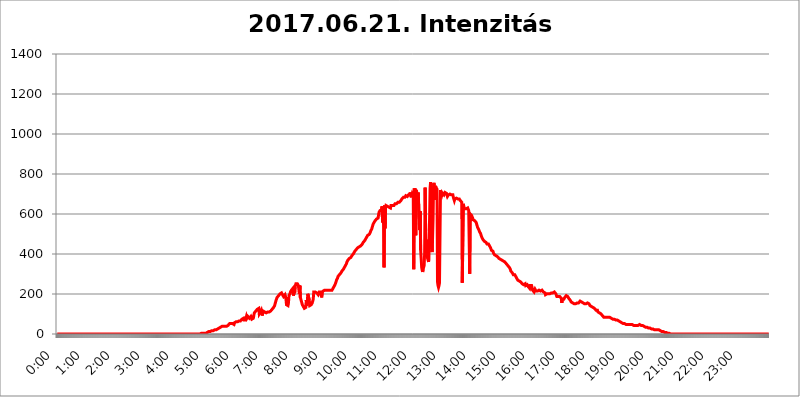
| Category | 2017.06.21. Intenzitás [W/m^2] |
|---|---|
| 0.0 | 0 |
| 0.0006944444444444445 | 0 |
| 0.001388888888888889 | 0 |
| 0.0020833333333333333 | 0 |
| 0.002777777777777778 | 0 |
| 0.003472222222222222 | 0 |
| 0.004166666666666667 | 0 |
| 0.004861111111111111 | 0 |
| 0.005555555555555556 | 0 |
| 0.0062499999999999995 | 0 |
| 0.006944444444444444 | 0 |
| 0.007638888888888889 | 0 |
| 0.008333333333333333 | 0 |
| 0.009027777777777779 | 0 |
| 0.009722222222222222 | 0 |
| 0.010416666666666666 | 0 |
| 0.011111111111111112 | 0 |
| 0.011805555555555555 | 0 |
| 0.012499999999999999 | 0 |
| 0.013194444444444444 | 0 |
| 0.013888888888888888 | 0 |
| 0.014583333333333332 | 0 |
| 0.015277777777777777 | 0 |
| 0.015972222222222224 | 0 |
| 0.016666666666666666 | 0 |
| 0.017361111111111112 | 0 |
| 0.018055555555555557 | 0 |
| 0.01875 | 0 |
| 0.019444444444444445 | 0 |
| 0.02013888888888889 | 0 |
| 0.020833333333333332 | 0 |
| 0.02152777777777778 | 0 |
| 0.022222222222222223 | 0 |
| 0.02291666666666667 | 0 |
| 0.02361111111111111 | 0 |
| 0.024305555555555556 | 0 |
| 0.024999999999999998 | 0 |
| 0.025694444444444447 | 0 |
| 0.02638888888888889 | 0 |
| 0.027083333333333334 | 0 |
| 0.027777777777777776 | 0 |
| 0.02847222222222222 | 0 |
| 0.029166666666666664 | 0 |
| 0.029861111111111113 | 0 |
| 0.030555555555555555 | 0 |
| 0.03125 | 0 |
| 0.03194444444444445 | 0 |
| 0.03263888888888889 | 0 |
| 0.03333333333333333 | 0 |
| 0.034027777777777775 | 0 |
| 0.034722222222222224 | 0 |
| 0.035416666666666666 | 0 |
| 0.036111111111111115 | 0 |
| 0.03680555555555556 | 0 |
| 0.0375 | 0 |
| 0.03819444444444444 | 0 |
| 0.03888888888888889 | 0 |
| 0.03958333333333333 | 0 |
| 0.04027777777777778 | 0 |
| 0.04097222222222222 | 0 |
| 0.041666666666666664 | 0 |
| 0.042361111111111106 | 0 |
| 0.04305555555555556 | 0 |
| 0.043750000000000004 | 0 |
| 0.044444444444444446 | 0 |
| 0.04513888888888889 | 0 |
| 0.04583333333333334 | 0 |
| 0.04652777777777778 | 0 |
| 0.04722222222222222 | 0 |
| 0.04791666666666666 | 0 |
| 0.04861111111111111 | 0 |
| 0.049305555555555554 | 0 |
| 0.049999999999999996 | 0 |
| 0.05069444444444445 | 0 |
| 0.051388888888888894 | 0 |
| 0.052083333333333336 | 0 |
| 0.05277777777777778 | 0 |
| 0.05347222222222222 | 0 |
| 0.05416666666666667 | 0 |
| 0.05486111111111111 | 0 |
| 0.05555555555555555 | 0 |
| 0.05625 | 0 |
| 0.05694444444444444 | 0 |
| 0.057638888888888885 | 0 |
| 0.05833333333333333 | 0 |
| 0.05902777777777778 | 0 |
| 0.059722222222222225 | 0 |
| 0.06041666666666667 | 0 |
| 0.061111111111111116 | 0 |
| 0.06180555555555556 | 0 |
| 0.0625 | 0 |
| 0.06319444444444444 | 0 |
| 0.06388888888888888 | 0 |
| 0.06458333333333334 | 0 |
| 0.06527777777777778 | 0 |
| 0.06597222222222222 | 0 |
| 0.06666666666666667 | 0 |
| 0.06736111111111111 | 0 |
| 0.06805555555555555 | 0 |
| 0.06874999999999999 | 0 |
| 0.06944444444444443 | 0 |
| 0.07013888888888889 | 0 |
| 0.07083333333333333 | 0 |
| 0.07152777777777779 | 0 |
| 0.07222222222222223 | 0 |
| 0.07291666666666667 | 0 |
| 0.07361111111111111 | 0 |
| 0.07430555555555556 | 0 |
| 0.075 | 0 |
| 0.07569444444444444 | 0 |
| 0.0763888888888889 | 0 |
| 0.07708333333333334 | 0 |
| 0.07777777777777778 | 0 |
| 0.07847222222222222 | 0 |
| 0.07916666666666666 | 0 |
| 0.0798611111111111 | 0 |
| 0.08055555555555556 | 0 |
| 0.08125 | 0 |
| 0.08194444444444444 | 0 |
| 0.08263888888888889 | 0 |
| 0.08333333333333333 | 0 |
| 0.08402777777777777 | 0 |
| 0.08472222222222221 | 0 |
| 0.08541666666666665 | 0 |
| 0.08611111111111112 | 0 |
| 0.08680555555555557 | 0 |
| 0.08750000000000001 | 0 |
| 0.08819444444444445 | 0 |
| 0.08888888888888889 | 0 |
| 0.08958333333333333 | 0 |
| 0.09027777777777778 | 0 |
| 0.09097222222222222 | 0 |
| 0.09166666666666667 | 0 |
| 0.09236111111111112 | 0 |
| 0.09305555555555556 | 0 |
| 0.09375 | 0 |
| 0.09444444444444444 | 0 |
| 0.09513888888888888 | 0 |
| 0.09583333333333333 | 0 |
| 0.09652777777777777 | 0 |
| 0.09722222222222222 | 0 |
| 0.09791666666666667 | 0 |
| 0.09861111111111111 | 0 |
| 0.09930555555555555 | 0 |
| 0.09999999999999999 | 0 |
| 0.10069444444444443 | 0 |
| 0.1013888888888889 | 0 |
| 0.10208333333333335 | 0 |
| 0.10277777777777779 | 0 |
| 0.10347222222222223 | 0 |
| 0.10416666666666667 | 0 |
| 0.10486111111111111 | 0 |
| 0.10555555555555556 | 0 |
| 0.10625 | 0 |
| 0.10694444444444444 | 0 |
| 0.1076388888888889 | 0 |
| 0.10833333333333334 | 0 |
| 0.10902777777777778 | 0 |
| 0.10972222222222222 | 0 |
| 0.1111111111111111 | 0 |
| 0.11180555555555556 | 0 |
| 0.11180555555555556 | 0 |
| 0.1125 | 0 |
| 0.11319444444444444 | 0 |
| 0.11388888888888889 | 0 |
| 0.11458333333333333 | 0 |
| 0.11527777777777777 | 0 |
| 0.11597222222222221 | 0 |
| 0.11666666666666665 | 0 |
| 0.1173611111111111 | 0 |
| 0.11805555555555557 | 0 |
| 0.11944444444444445 | 0 |
| 0.12013888888888889 | 0 |
| 0.12083333333333333 | 0 |
| 0.12152777777777778 | 0 |
| 0.12222222222222223 | 0 |
| 0.12291666666666667 | 0 |
| 0.12291666666666667 | 0 |
| 0.12361111111111112 | 0 |
| 0.12430555555555556 | 0 |
| 0.125 | 0 |
| 0.12569444444444444 | 0 |
| 0.12638888888888888 | 0 |
| 0.12708333333333333 | 0 |
| 0.16875 | 0 |
| 0.12847222222222224 | 0 |
| 0.12916666666666668 | 0 |
| 0.12986111111111112 | 0 |
| 0.13055555555555556 | 0 |
| 0.13125 | 0 |
| 0.13194444444444445 | 0 |
| 0.1326388888888889 | 0 |
| 0.13333333333333333 | 0 |
| 0.13402777777777777 | 0 |
| 0.13402777777777777 | 0 |
| 0.13472222222222222 | 0 |
| 0.13541666666666666 | 0 |
| 0.1361111111111111 | 0 |
| 0.13749999999999998 | 0 |
| 0.13819444444444443 | 0 |
| 0.1388888888888889 | 0 |
| 0.13958333333333334 | 0 |
| 0.14027777777777778 | 0 |
| 0.14097222222222222 | 0 |
| 0.14166666666666666 | 0 |
| 0.1423611111111111 | 0 |
| 0.14305555555555557 | 0 |
| 0.14375000000000002 | 0 |
| 0.14444444444444446 | 0 |
| 0.1451388888888889 | 0 |
| 0.1451388888888889 | 0 |
| 0.14652777777777778 | 0 |
| 0.14722222222222223 | 0 |
| 0.14791666666666667 | 0 |
| 0.1486111111111111 | 0 |
| 0.14930555555555555 | 0 |
| 0.15 | 0 |
| 0.15069444444444444 | 0 |
| 0.15138888888888888 | 0 |
| 0.15208333333333332 | 0 |
| 0.15277777777777776 | 0 |
| 0.15347222222222223 | 0 |
| 0.15416666666666667 | 0 |
| 0.15486111111111112 | 0 |
| 0.15555555555555556 | 0 |
| 0.15625 | 0 |
| 0.15694444444444444 | 0 |
| 0.15763888888888888 | 0 |
| 0.15833333333333333 | 0 |
| 0.15902777777777777 | 0 |
| 0.15972222222222224 | 0 |
| 0.16041666666666668 | 0 |
| 0.16111111111111112 | 0 |
| 0.16180555555555556 | 0 |
| 0.1625 | 0 |
| 0.16319444444444445 | 0 |
| 0.1638888888888889 | 0 |
| 0.16458333333333333 | 0 |
| 0.16527777777777777 | 0 |
| 0.16597222222222222 | 0 |
| 0.16666666666666666 | 0 |
| 0.1673611111111111 | 0 |
| 0.16805555555555554 | 0 |
| 0.16874999999999998 | 0 |
| 0.16944444444444443 | 0 |
| 0.17013888888888887 | 0 |
| 0.1708333333333333 | 0 |
| 0.17152777777777775 | 0 |
| 0.17222222222222225 | 0 |
| 0.1729166666666667 | 0 |
| 0.17361111111111113 | 0 |
| 0.17430555555555557 | 0 |
| 0.17500000000000002 | 0 |
| 0.17569444444444446 | 0 |
| 0.1763888888888889 | 0 |
| 0.17708333333333334 | 0 |
| 0.17777777777777778 | 0 |
| 0.17847222222222223 | 0 |
| 0.17916666666666667 | 0 |
| 0.1798611111111111 | 0 |
| 0.18055555555555555 | 0 |
| 0.18125 | 0 |
| 0.18194444444444444 | 0 |
| 0.1826388888888889 | 0 |
| 0.18333333333333335 | 0 |
| 0.1840277777777778 | 0 |
| 0.18472222222222223 | 0 |
| 0.18541666666666667 | 0 |
| 0.18611111111111112 | 0 |
| 0.18680555555555556 | 0 |
| 0.1875 | 0 |
| 0.18819444444444444 | 0 |
| 0.18888888888888888 | 0 |
| 0.18958333333333333 | 0 |
| 0.19027777777777777 | 0 |
| 0.1909722222222222 | 0 |
| 0.19166666666666665 | 0 |
| 0.19236111111111112 | 0 |
| 0.19305555555555554 | 0 |
| 0.19375 | 0 |
| 0.19444444444444445 | 0 |
| 0.1951388888888889 | 0 |
| 0.19583333333333333 | 0 |
| 0.19652777777777777 | 0 |
| 0.19722222222222222 | 0 |
| 0.19791666666666666 | 0 |
| 0.1986111111111111 | 0 |
| 0.19930555555555554 | 0 |
| 0.19999999999999998 | 0 |
| 0.20069444444444443 | 0 |
| 0.20138888888888887 | 3.525 |
| 0.2020833333333333 | 3.525 |
| 0.2027777777777778 | 3.525 |
| 0.2034722222222222 | 3.525 |
| 0.2041666666666667 | 3.525 |
| 0.20486111111111113 | 3.525 |
| 0.20555555555555557 | 3.525 |
| 0.20625000000000002 | 3.525 |
| 0.20694444444444446 | 3.525 |
| 0.2076388888888889 | 3.525 |
| 0.20833333333333334 | 3.525 |
| 0.20902777777777778 | 7.887 |
| 0.20972222222222223 | 7.887 |
| 0.21041666666666667 | 7.887 |
| 0.2111111111111111 | 7.887 |
| 0.21180555555555555 | 7.887 |
| 0.2125 | 12.257 |
| 0.21319444444444444 | 12.257 |
| 0.2138888888888889 | 12.257 |
| 0.21458333333333335 | 12.257 |
| 0.2152777777777778 | 12.257 |
| 0.21597222222222223 | 12.257 |
| 0.21666666666666667 | 16.636 |
| 0.21736111111111112 | 16.636 |
| 0.21805555555555556 | 16.636 |
| 0.21875 | 16.636 |
| 0.21944444444444444 | 21.024 |
| 0.22013888888888888 | 21.024 |
| 0.22083333333333333 | 21.024 |
| 0.22152777777777777 | 21.024 |
| 0.2222222222222222 | 21.024 |
| 0.22291666666666665 | 21.024 |
| 0.2236111111111111 | 21.024 |
| 0.22430555555555556 | 25.419 |
| 0.225 | 25.419 |
| 0.22569444444444445 | 25.419 |
| 0.2263888888888889 | 29.823 |
| 0.22708333333333333 | 29.823 |
| 0.22777777777777777 | 29.823 |
| 0.22847222222222222 | 34.234 |
| 0.22916666666666666 | 34.234 |
| 0.2298611111111111 | 34.234 |
| 0.23055555555555554 | 34.234 |
| 0.23124999999999998 | 38.653 |
| 0.23194444444444443 | 38.653 |
| 0.23263888888888887 | 38.653 |
| 0.2333333333333333 | 38.653 |
| 0.2340277777777778 | 38.653 |
| 0.2347222222222222 | 38.653 |
| 0.2354166666666667 | 38.653 |
| 0.23611111111111113 | 38.653 |
| 0.23680555555555557 | 38.653 |
| 0.23750000000000002 | 38.653 |
| 0.23819444444444446 | 38.653 |
| 0.2388888888888889 | 38.653 |
| 0.23958333333333334 | 43.079 |
| 0.24027777777777778 | 47.511 |
| 0.24097222222222223 | 47.511 |
| 0.24166666666666667 | 51.951 |
| 0.2423611111111111 | 51.951 |
| 0.24305555555555555 | 51.951 |
| 0.24375 | 51.951 |
| 0.24444444444444446 | 51.951 |
| 0.24513888888888888 | 51.951 |
| 0.24583333333333335 | 51.951 |
| 0.2465277777777778 | 51.951 |
| 0.24722222222222223 | 51.951 |
| 0.24791666666666667 | 47.511 |
| 0.24861111111111112 | 56.398 |
| 0.24930555555555556 | 56.398 |
| 0.25 | 56.398 |
| 0.25069444444444444 | 60.85 |
| 0.2513888888888889 | 60.85 |
| 0.2520833333333333 | 60.85 |
| 0.25277777777777777 | 60.85 |
| 0.2534722222222222 | 65.31 |
| 0.25416666666666665 | 65.31 |
| 0.2548611111111111 | 65.31 |
| 0.2555555555555556 | 65.31 |
| 0.25625000000000003 | 65.31 |
| 0.2569444444444445 | 65.31 |
| 0.2576388888888889 | 69.775 |
| 0.25833333333333336 | 69.775 |
| 0.2590277777777778 | 74.246 |
| 0.25972222222222224 | 74.246 |
| 0.2604166666666667 | 78.722 |
| 0.2611111111111111 | 78.722 |
| 0.26180555555555557 | 69.775 |
| 0.2625 | 65.31 |
| 0.26319444444444445 | 65.31 |
| 0.2638888888888889 | 69.775 |
| 0.26458333333333334 | 74.246 |
| 0.2652777777777778 | 87.692 |
| 0.2659722222222222 | 78.722 |
| 0.26666666666666666 | 74.246 |
| 0.2673611111111111 | 87.692 |
| 0.26805555555555555 | 83.205 |
| 0.26875 | 83.205 |
| 0.26944444444444443 | 78.722 |
| 0.2701388888888889 | 74.246 |
| 0.2708333333333333 | 74.246 |
| 0.27152777777777776 | 87.692 |
| 0.2722222222222222 | 83.205 |
| 0.27291666666666664 | 74.246 |
| 0.2736111111111111 | 74.246 |
| 0.2743055555555555 | 74.246 |
| 0.27499999999999997 | 78.722 |
| 0.27569444444444446 | 83.205 |
| 0.27638888888888885 | 105.69 |
| 0.27708333333333335 | 110.201 |
| 0.2777777777777778 | 110.201 |
| 0.27847222222222223 | 114.716 |
| 0.2791666666666667 | 114.716 |
| 0.2798611111111111 | 119.235 |
| 0.28055555555555556 | 123.758 |
| 0.28125 | 123.758 |
| 0.28194444444444444 | 128.284 |
| 0.2826388888888889 | 128.284 |
| 0.2833333333333333 | 101.184 |
| 0.28402777777777777 | 101.184 |
| 0.2847222222222222 | 110.201 |
| 0.28541666666666665 | 110.201 |
| 0.28611111111111115 | 119.235 |
| 0.28680555555555554 | 105.69 |
| 0.28750000000000003 | 92.184 |
| 0.2881944444444445 | 87.692 |
| 0.2888888888888889 | 114.716 |
| 0.28958333333333336 | 110.201 |
| 0.2902777777777778 | 110.201 |
| 0.29097222222222224 | 110.201 |
| 0.2916666666666667 | 105.69 |
| 0.2923611111111111 | 105.69 |
| 0.29305555555555557 | 105.69 |
| 0.29375 | 105.69 |
| 0.29444444444444445 | 105.69 |
| 0.2951388888888889 | 110.201 |
| 0.29583333333333334 | 110.201 |
| 0.2965277777777778 | 110.201 |
| 0.2972222222222222 | 110.201 |
| 0.29791666666666666 | 114.716 |
| 0.2986111111111111 | 114.716 |
| 0.29930555555555555 | 114.716 |
| 0.3 | 119.235 |
| 0.30069444444444443 | 119.235 |
| 0.3013888888888889 | 123.758 |
| 0.3020833333333333 | 128.284 |
| 0.30277777777777776 | 128.284 |
| 0.3034722222222222 | 132.814 |
| 0.30416666666666664 | 137.347 |
| 0.3048611111111111 | 141.884 |
| 0.3055555555555555 | 150.964 |
| 0.30624999999999997 | 155.509 |
| 0.3069444444444444 | 169.156 |
| 0.3076388888888889 | 173.709 |
| 0.30833333333333335 | 182.82 |
| 0.3090277777777778 | 182.82 |
| 0.30972222222222223 | 187.378 |
| 0.3104166666666667 | 191.937 |
| 0.3111111111111111 | 191.937 |
| 0.31180555555555556 | 196.497 |
| 0.3125 | 201.058 |
| 0.31319444444444444 | 201.058 |
| 0.3138888888888889 | 205.62 |
| 0.3145833333333333 | 205.62 |
| 0.31527777777777777 | 201.058 |
| 0.3159722222222222 | 196.497 |
| 0.31666666666666665 | 191.937 |
| 0.31736111111111115 | 187.378 |
| 0.31805555555555554 | 182.82 |
| 0.31875000000000003 | 182.82 |
| 0.3194444444444445 | 196.497 |
| 0.3201388888888889 | 187.378 |
| 0.32083333333333336 | 173.709 |
| 0.3215277777777778 | 146.423 |
| 0.32222222222222224 | 141.884 |
| 0.3229166666666667 | 141.884 |
| 0.3236111111111111 | 141.884 |
| 0.32430555555555557 | 155.509 |
| 0.325 | 191.937 |
| 0.32569444444444445 | 196.497 |
| 0.3263888888888889 | 201.058 |
| 0.32708333333333334 | 210.182 |
| 0.3277777777777778 | 214.746 |
| 0.3284722222222222 | 219.309 |
| 0.32916666666666666 | 223.873 |
| 0.3298611111111111 | 223.873 |
| 0.33055555555555555 | 228.436 |
| 0.33125 | 191.937 |
| 0.33194444444444443 | 201.058 |
| 0.3326388888888889 | 205.62 |
| 0.3333333333333333 | 210.182 |
| 0.3340277777777778 | 242.127 |
| 0.3347222222222222 | 251.251 |
| 0.3354166666666667 | 251.251 |
| 0.3361111111111111 | 251.251 |
| 0.3368055555555556 | 251.251 |
| 0.33749999999999997 | 251.251 |
| 0.33819444444444446 | 242.127 |
| 0.33888888888888885 | 242.127 |
| 0.33958333333333335 | 201.058 |
| 0.34027777777777773 | 242.127 |
| 0.34097222222222223 | 182.82 |
| 0.3416666666666666 | 173.709 |
| 0.3423611111111111 | 164.605 |
| 0.3430555555555555 | 155.509 |
| 0.34375 | 146.423 |
| 0.3444444444444445 | 141.884 |
| 0.3451388888888889 | 137.347 |
| 0.3458333333333334 | 132.814 |
| 0.34652777777777777 | 128.284 |
| 0.34722222222222227 | 128.284 |
| 0.34791666666666665 | 128.284 |
| 0.34861111111111115 | 132.814 |
| 0.34930555555555554 | 169.156 |
| 0.35000000000000003 | 141.884 |
| 0.3506944444444444 | 150.964 |
| 0.3513888888888889 | 201.058 |
| 0.3520833333333333 | 201.058 |
| 0.3527777777777778 | 205.62 |
| 0.3534722222222222 | 169.156 |
| 0.3541666666666667 | 141.884 |
| 0.3548611111111111 | 137.347 |
| 0.35555555555555557 | 137.347 |
| 0.35625 | 146.423 |
| 0.35694444444444445 | 141.884 |
| 0.3576388888888889 | 155.509 |
| 0.35833333333333334 | 160.056 |
| 0.3590277777777778 | 173.709 |
| 0.3597222222222222 | 210.182 |
| 0.36041666666666666 | 210.182 |
| 0.3611111111111111 | 210.182 |
| 0.36180555555555555 | 210.182 |
| 0.3625 | 210.182 |
| 0.36319444444444443 | 214.746 |
| 0.3638888888888889 | 205.62 |
| 0.3645833333333333 | 210.182 |
| 0.3652777777777778 | 210.182 |
| 0.3659722222222222 | 196.497 |
| 0.3666666666666667 | 196.497 |
| 0.3673611111111111 | 210.182 |
| 0.3680555555555556 | 210.182 |
| 0.36874999999999997 | 210.182 |
| 0.36944444444444446 | 210.182 |
| 0.37013888888888885 | 210.182 |
| 0.37083333333333335 | 182.82 |
| 0.37152777777777773 | 205.62 |
| 0.37222222222222223 | 210.182 |
| 0.3729166666666666 | 214.746 |
| 0.3736111111111111 | 214.746 |
| 0.3743055555555555 | 210.182 |
| 0.375 | 219.309 |
| 0.3756944444444445 | 214.746 |
| 0.3763888888888889 | 219.309 |
| 0.3770833333333334 | 219.309 |
| 0.37777777777777777 | 219.309 |
| 0.37847222222222227 | 219.309 |
| 0.37916666666666665 | 219.309 |
| 0.37986111111111115 | 219.309 |
| 0.38055555555555554 | 219.309 |
| 0.38125000000000003 | 219.309 |
| 0.3819444444444444 | 219.309 |
| 0.3826388888888889 | 219.309 |
| 0.3833333333333333 | 219.309 |
| 0.3840277777777778 | 219.309 |
| 0.3847222222222222 | 219.309 |
| 0.3854166666666667 | 219.309 |
| 0.3861111111111111 | 223.873 |
| 0.38680555555555557 | 228.436 |
| 0.3875 | 233 |
| 0.38819444444444445 | 237.564 |
| 0.3888888888888889 | 242.127 |
| 0.38958333333333334 | 246.689 |
| 0.3902777777777778 | 251.251 |
| 0.3909722222222222 | 260.373 |
| 0.39166666666666666 | 269.49 |
| 0.3923611111111111 | 274.047 |
| 0.39305555555555555 | 278.603 |
| 0.39375 | 287.709 |
| 0.39444444444444443 | 287.709 |
| 0.3951388888888889 | 292.259 |
| 0.3958333333333333 | 296.808 |
| 0.3965277777777778 | 301.354 |
| 0.3972222222222222 | 301.354 |
| 0.3979166666666667 | 305.898 |
| 0.3986111111111111 | 310.44 |
| 0.3993055555555556 | 314.98 |
| 0.39999999999999997 | 314.98 |
| 0.40069444444444446 | 319.517 |
| 0.40138888888888885 | 324.052 |
| 0.40208333333333335 | 328.584 |
| 0.40277777777777773 | 333.113 |
| 0.40347222222222223 | 337.639 |
| 0.4041666666666666 | 342.162 |
| 0.4048611111111111 | 346.682 |
| 0.4055555555555555 | 351.198 |
| 0.40625 | 360.221 |
| 0.4069444444444445 | 364.728 |
| 0.4076388888888889 | 369.23 |
| 0.4083333333333334 | 369.23 |
| 0.40902777777777777 | 373.729 |
| 0.40972222222222227 | 378.224 |
| 0.41041666666666665 | 378.224 |
| 0.41111111111111115 | 378.224 |
| 0.41180555555555554 | 382.715 |
| 0.41250000000000003 | 387.202 |
| 0.4131944444444444 | 391.685 |
| 0.4138888888888889 | 391.685 |
| 0.4145833333333333 | 396.164 |
| 0.4152777777777778 | 400.638 |
| 0.4159722222222222 | 405.108 |
| 0.4166666666666667 | 405.108 |
| 0.4173611111111111 | 414.035 |
| 0.41805555555555557 | 414.035 |
| 0.41875 | 418.492 |
| 0.41944444444444445 | 422.943 |
| 0.4201388888888889 | 422.943 |
| 0.42083333333333334 | 427.39 |
| 0.4215277777777778 | 431.833 |
| 0.4222222222222222 | 431.833 |
| 0.42291666666666666 | 431.833 |
| 0.4236111111111111 | 436.27 |
| 0.42430555555555555 | 436.27 |
| 0.425 | 440.702 |
| 0.42569444444444443 | 440.702 |
| 0.4263888888888889 | 445.129 |
| 0.4270833333333333 | 445.129 |
| 0.4277777777777778 | 449.551 |
| 0.4284722222222222 | 453.968 |
| 0.4291666666666667 | 458.38 |
| 0.4298611111111111 | 462.786 |
| 0.4305555555555556 | 462.786 |
| 0.43124999999999997 | 467.187 |
| 0.43194444444444446 | 471.582 |
| 0.43263888888888885 | 475.972 |
| 0.43333333333333335 | 480.356 |
| 0.43402777777777773 | 484.735 |
| 0.43472222222222223 | 489.108 |
| 0.4354166666666666 | 493.475 |
| 0.4361111111111111 | 497.836 |
| 0.4368055555555555 | 497.836 |
| 0.4375 | 497.836 |
| 0.4381944444444445 | 502.192 |
| 0.4388888888888889 | 506.542 |
| 0.4395833333333334 | 515.223 |
| 0.44027777777777777 | 519.555 |
| 0.44097222222222227 | 523.88 |
| 0.44166666666666665 | 532.513 |
| 0.44236111111111115 | 541.121 |
| 0.44305555555555554 | 549.704 |
| 0.44375000000000003 | 553.986 |
| 0.4444444444444444 | 558.261 |
| 0.4451388888888889 | 562.53 |
| 0.4458333333333333 | 566.793 |
| 0.4465277777777778 | 571.049 |
| 0.4472222222222222 | 571.049 |
| 0.4479166666666667 | 575.299 |
| 0.4486111111111111 | 579.542 |
| 0.44930555555555557 | 575.299 |
| 0.45 | 579.542 |
| 0.45069444444444445 | 596.45 |
| 0.4513888888888889 | 609.062 |
| 0.45208333333333334 | 613.252 |
| 0.4527777777777778 | 617.436 |
| 0.4534722222222222 | 613.252 |
| 0.45416666666666666 | 613.252 |
| 0.4548611111111111 | 621.613 |
| 0.45555555555555555 | 638.256 |
| 0.45625 | 558.261 |
| 0.45694444444444443 | 596.45 |
| 0.4576388888888889 | 549.704 |
| 0.4583333333333333 | 333.113 |
| 0.4590277777777778 | 642.4 |
| 0.4597222222222222 | 528.2 |
| 0.4604166666666667 | 629.948 |
| 0.4611111111111111 | 642.4 |
| 0.4618055555555556 | 646.537 |
| 0.46249999999999997 | 638.256 |
| 0.46319444444444446 | 638.256 |
| 0.46388888888888885 | 634.105 |
| 0.46458333333333335 | 638.256 |
| 0.46527777777777773 | 634.105 |
| 0.46597222222222223 | 629.948 |
| 0.4666666666666666 | 634.105 |
| 0.4673611111111111 | 629.948 |
| 0.4680555555555555 | 642.4 |
| 0.46875 | 642.4 |
| 0.4694444444444445 | 642.4 |
| 0.4701388888888889 | 642.4 |
| 0.4708333333333334 | 646.537 |
| 0.47152777777777777 | 646.537 |
| 0.47222222222222227 | 642.4 |
| 0.47291666666666665 | 646.537 |
| 0.47361111111111115 | 650.667 |
| 0.47430555555555554 | 650.667 |
| 0.47500000000000003 | 650.667 |
| 0.4756944444444444 | 650.667 |
| 0.4763888888888889 | 650.667 |
| 0.4770833333333333 | 654.791 |
| 0.4777777777777778 | 658.909 |
| 0.4784722222222222 | 658.909 |
| 0.4791666666666667 | 658.909 |
| 0.4798611111111111 | 658.909 |
| 0.48055555555555557 | 663.019 |
| 0.48125 | 663.019 |
| 0.48194444444444445 | 667.123 |
| 0.4826388888888889 | 671.22 |
| 0.48333333333333334 | 675.311 |
| 0.4840277777777778 | 675.311 |
| 0.4847222222222222 | 679.395 |
| 0.48541666666666666 | 683.473 |
| 0.4861111111111111 | 683.473 |
| 0.48680555555555555 | 683.473 |
| 0.4875 | 683.473 |
| 0.48819444444444443 | 687.544 |
| 0.4888888888888889 | 691.608 |
| 0.4895833333333333 | 687.544 |
| 0.4902777777777778 | 687.544 |
| 0.4909722222222222 | 687.544 |
| 0.4916666666666667 | 691.608 |
| 0.4923611111111111 | 695.666 |
| 0.4930555555555556 | 695.666 |
| 0.49374999999999997 | 699.717 |
| 0.49444444444444446 | 699.717 |
| 0.49513888888888885 | 707.8 |
| 0.49583333333333335 | 703.762 |
| 0.49652777777777773 | 683.473 |
| 0.49722222222222223 | 695.666 |
| 0.4979166666666666 | 703.762 |
| 0.4986111111111111 | 707.8 |
| 0.4993055555555555 | 695.666 |
| 0.5 | 324.052 |
| 0.5006944444444444 | 727.896 |
| 0.5013888888888889 | 719.877 |
| 0.5020833333333333 | 727.896 |
| 0.5027777777777778 | 493.475 |
| 0.5034722222222222 | 719.877 |
| 0.5041666666666667 | 707.8 |
| 0.5048611111111111 | 646.537 |
| 0.5055555555555555 | 675.311 |
| 0.50625 | 707.8 |
| 0.5069444444444444 | 711.832 |
| 0.5076388888888889 | 575.299 |
| 0.5083333333333333 | 519.555 |
| 0.5090277777777777 | 613.252 |
| 0.5097222222222222 | 418.492 |
| 0.5104166666666666 | 378.224 |
| 0.5111111111111112 | 333.113 |
| 0.5118055555555555 | 319.517 |
| 0.5125000000000001 | 310.44 |
| 0.5131944444444444 | 324.052 |
| 0.513888888888889 | 319.517 |
| 0.5145833333333333 | 342.162 |
| 0.5152777777777778 | 405.108 |
| 0.5159722222222222 | 731.896 |
| 0.5166666666666667 | 515.223 |
| 0.517361111111111 | 409.574 |
| 0.5180555555555556 | 387.202 |
| 0.5187499999999999 | 471.582 |
| 0.5194444444444445 | 378.224 |
| 0.5201388888888888 | 369.23 |
| 0.5208333333333334 | 360.221 |
| 0.5215277777777778 | 471.582 |
| 0.5222222222222223 | 579.542 |
| 0.5229166666666667 | 727.896 |
| 0.5236111111111111 | 759.723 |
| 0.5243055555555556 | 436.27 |
| 0.525 | 449.551 |
| 0.5256944444444445 | 409.574 |
| 0.5263888888888889 | 480.356 |
| 0.5270833333333333 | 575.299 |
| 0.5277777777777778 | 747.834 |
| 0.5284722222222222 | 755.766 |
| 0.5291666666666667 | 759.723 |
| 0.5298611111111111 | 671.22 |
| 0.5305555555555556 | 739.877 |
| 0.53125 | 731.896 |
| 0.5319444444444444 | 727.896 |
| 0.5326388888888889 | 723.889 |
| 0.5333333333333333 | 260.373 |
| 0.5340277777777778 | 242.127 |
| 0.5347222222222222 | 233 |
| 0.5354166666666667 | 242.127 |
| 0.5361111111111111 | 255.813 |
| 0.5368055555555555 | 260.373 |
| 0.5375 | 719.877 |
| 0.5381944444444444 | 715.858 |
| 0.5388888888888889 | 703.762 |
| 0.5395833333333333 | 695.666 |
| 0.5402777777777777 | 703.762 |
| 0.5409722222222222 | 703.762 |
| 0.5416666666666666 | 699.717 |
| 0.5423611111111112 | 695.666 |
| 0.5430555555555555 | 691.608 |
| 0.5437500000000001 | 707.8 |
| 0.5444444444444444 | 707.8 |
| 0.545138888888889 | 703.762 |
| 0.5458333333333333 | 703.762 |
| 0.5465277777777778 | 695.666 |
| 0.5472222222222222 | 687.544 |
| 0.5479166666666667 | 683.473 |
| 0.548611111111111 | 695.666 |
| 0.5493055555555556 | 691.608 |
| 0.5499999999999999 | 695.666 |
| 0.5506944444444445 | 699.717 |
| 0.5513888888888888 | 699.717 |
| 0.5520833333333334 | 695.666 |
| 0.5527777777777778 | 695.666 |
| 0.5534722222222223 | 691.608 |
| 0.5541666666666667 | 699.717 |
| 0.5548611111111111 | 695.666 |
| 0.5555555555555556 | 683.473 |
| 0.55625 | 675.311 |
| 0.5569444444444445 | 667.123 |
| 0.5576388888888889 | 675.311 |
| 0.5583333333333333 | 675.311 |
| 0.5590277777777778 | 679.395 |
| 0.5597222222222222 | 679.395 |
| 0.5604166666666667 | 675.311 |
| 0.5611111111111111 | 675.311 |
| 0.5618055555555556 | 675.311 |
| 0.5625 | 675.311 |
| 0.5631944444444444 | 675.311 |
| 0.5638888888888889 | 675.311 |
| 0.5645833333333333 | 671.22 |
| 0.5652777777777778 | 667.123 |
| 0.5659722222222222 | 671.22 |
| 0.5666666666666667 | 667.123 |
| 0.5673611111111111 | 658.909 |
| 0.5680555555555555 | 255.813 |
| 0.56875 | 255.813 |
| 0.5694444444444444 | 650.667 |
| 0.5701388888888889 | 638.256 |
| 0.5708333333333333 | 634.105 |
| 0.5715277777777777 | 625.784 |
| 0.5722222222222222 | 629.948 |
| 0.5729166666666666 | 625.784 |
| 0.5736111111111112 | 625.784 |
| 0.5743055555555555 | 621.613 |
| 0.5750000000000001 | 629.948 |
| 0.5756944444444444 | 629.948 |
| 0.576388888888889 | 625.784 |
| 0.5770833333333333 | 617.436 |
| 0.5777777777777778 | 613.252 |
| 0.5784722222222222 | 301.354 |
| 0.5791666666666667 | 600.661 |
| 0.579861111111111 | 600.661 |
| 0.5805555555555556 | 596.45 |
| 0.5812499999999999 | 592.233 |
| 0.5819444444444445 | 588.009 |
| 0.5826388888888888 | 579.542 |
| 0.5833333333333334 | 571.049 |
| 0.5840277777777778 | 566.793 |
| 0.5847222222222223 | 566.793 |
| 0.5854166666666667 | 566.793 |
| 0.5861111111111111 | 566.793 |
| 0.5868055555555556 | 566.793 |
| 0.5875 | 558.261 |
| 0.5881944444444445 | 549.704 |
| 0.5888888888888889 | 541.121 |
| 0.5895833333333333 | 532.513 |
| 0.5902777777777778 | 532.513 |
| 0.5909722222222222 | 523.88 |
| 0.5916666666666667 | 519.555 |
| 0.5923611111111111 | 510.885 |
| 0.5930555555555556 | 506.542 |
| 0.59375 | 502.192 |
| 0.5944444444444444 | 493.475 |
| 0.5951388888888889 | 489.108 |
| 0.5958333333333333 | 480.356 |
| 0.5965277777777778 | 475.972 |
| 0.5972222222222222 | 471.582 |
| 0.5979166666666667 | 471.582 |
| 0.5986111111111111 | 467.187 |
| 0.5993055555555555 | 462.786 |
| 0.6 | 462.786 |
| 0.6006944444444444 | 458.38 |
| 0.6013888888888889 | 458.38 |
| 0.6020833333333333 | 453.968 |
| 0.6027777777777777 | 449.551 |
| 0.6034722222222222 | 453.968 |
| 0.6041666666666666 | 453.968 |
| 0.6048611111111112 | 449.551 |
| 0.6055555555555555 | 449.551 |
| 0.6062500000000001 | 440.702 |
| 0.6069444444444444 | 436.27 |
| 0.607638888888889 | 431.833 |
| 0.6083333333333333 | 427.39 |
| 0.6090277777777778 | 418.492 |
| 0.6097222222222222 | 414.035 |
| 0.6104166666666667 | 414.035 |
| 0.611111111111111 | 414.035 |
| 0.6118055555555556 | 405.108 |
| 0.6124999999999999 | 405.108 |
| 0.6131944444444445 | 396.164 |
| 0.6138888888888888 | 396.164 |
| 0.6145833333333334 | 396.164 |
| 0.6152777777777778 | 391.685 |
| 0.6159722222222223 | 391.685 |
| 0.6166666666666667 | 387.202 |
| 0.6173611111111111 | 387.202 |
| 0.6180555555555556 | 382.715 |
| 0.61875 | 382.715 |
| 0.6194444444444445 | 378.224 |
| 0.6201388888888889 | 378.224 |
| 0.6208333333333333 | 378.224 |
| 0.6215277777777778 | 373.729 |
| 0.6222222222222222 | 369.23 |
| 0.6229166666666667 | 373.729 |
| 0.6236111111111111 | 369.23 |
| 0.6243055555555556 | 369.23 |
| 0.625 | 369.23 |
| 0.6256944444444444 | 364.728 |
| 0.6263888888888889 | 360.221 |
| 0.6270833333333333 | 360.221 |
| 0.6277777777777778 | 360.221 |
| 0.6284722222222222 | 355.712 |
| 0.6291666666666667 | 355.712 |
| 0.6298611111111111 | 351.198 |
| 0.6305555555555555 | 346.682 |
| 0.63125 | 346.682 |
| 0.6319444444444444 | 342.162 |
| 0.6326388888888889 | 337.639 |
| 0.6333333333333333 | 337.639 |
| 0.6340277777777777 | 333.113 |
| 0.6347222222222222 | 328.584 |
| 0.6354166666666666 | 324.052 |
| 0.6361111111111112 | 314.98 |
| 0.6368055555555555 | 314.98 |
| 0.6375000000000001 | 310.44 |
| 0.6381944444444444 | 305.898 |
| 0.638888888888889 | 305.898 |
| 0.6395833333333333 | 296.808 |
| 0.6402777777777778 | 296.808 |
| 0.6409722222222222 | 296.808 |
| 0.6416666666666667 | 296.808 |
| 0.642361111111111 | 292.259 |
| 0.6430555555555556 | 287.709 |
| 0.6437499999999999 | 283.156 |
| 0.6444444444444445 | 278.603 |
| 0.6451388888888888 | 274.047 |
| 0.6458333333333334 | 269.49 |
| 0.6465277777777778 | 269.49 |
| 0.6472222222222223 | 264.932 |
| 0.6479166666666667 | 264.932 |
| 0.6486111111111111 | 260.373 |
| 0.6493055555555556 | 260.373 |
| 0.65 | 260.373 |
| 0.6506944444444445 | 255.813 |
| 0.6513888888888889 | 255.813 |
| 0.6520833333333333 | 251.251 |
| 0.6527777777777778 | 251.251 |
| 0.6534722222222222 | 251.251 |
| 0.6541666666666667 | 246.689 |
| 0.6548611111111111 | 242.127 |
| 0.6555555555555556 | 242.127 |
| 0.65625 | 251.251 |
| 0.6569444444444444 | 242.127 |
| 0.6576388888888889 | 246.689 |
| 0.6583333333333333 | 246.689 |
| 0.6590277777777778 | 246.689 |
| 0.6597222222222222 | 242.127 |
| 0.6604166666666667 | 237.564 |
| 0.6611111111111111 | 233 |
| 0.6618055555555555 | 233 |
| 0.6625 | 228.436 |
| 0.6631944444444444 | 242.127 |
| 0.6638888888888889 | 246.689 |
| 0.6645833333333333 | 242.127 |
| 0.6652777777777777 | 242.127 |
| 0.6659722222222222 | 233 |
| 0.6666666666666666 | 219.309 |
| 0.6673611111111111 | 219.309 |
| 0.6680555555555556 | 214.746 |
| 0.6687500000000001 | 210.182 |
| 0.6694444444444444 | 214.746 |
| 0.6701388888888888 | 223.873 |
| 0.6708333333333334 | 219.309 |
| 0.6715277777777778 | 214.746 |
| 0.6722222222222222 | 210.182 |
| 0.6729166666666666 | 219.309 |
| 0.6736111111111112 | 214.746 |
| 0.6743055555555556 | 210.182 |
| 0.6749999999999999 | 210.182 |
| 0.6756944444444444 | 219.309 |
| 0.6763888888888889 | 219.309 |
| 0.6770833333333334 | 219.309 |
| 0.6777777777777777 | 214.746 |
| 0.6784722222222223 | 214.746 |
| 0.6791666666666667 | 219.309 |
| 0.6798611111111111 | 219.309 |
| 0.6805555555555555 | 219.309 |
| 0.68125 | 214.746 |
| 0.6819444444444445 | 210.182 |
| 0.6826388888888889 | 210.182 |
| 0.6833333333333332 | 205.62 |
| 0.6840277777777778 | 205.62 |
| 0.6847222222222222 | 196.497 |
| 0.6854166666666667 | 196.497 |
| 0.686111111111111 | 201.058 |
| 0.6868055555555556 | 201.058 |
| 0.6875 | 201.058 |
| 0.6881944444444444 | 201.058 |
| 0.688888888888889 | 201.058 |
| 0.6895833333333333 | 201.058 |
| 0.6902777777777778 | 201.058 |
| 0.6909722222222222 | 201.058 |
| 0.6916666666666668 | 205.62 |
| 0.6923611111111111 | 205.62 |
| 0.6930555555555555 | 205.62 |
| 0.69375 | 205.62 |
| 0.6944444444444445 | 205.62 |
| 0.6951388888888889 | 205.62 |
| 0.6958333333333333 | 205.62 |
| 0.6965277777777777 | 210.182 |
| 0.6972222222222223 | 210.182 |
| 0.6979166666666666 | 210.182 |
| 0.6986111111111111 | 210.182 |
| 0.6993055555555556 | 201.058 |
| 0.7000000000000001 | 196.497 |
| 0.7006944444444444 | 187.378 |
| 0.7013888888888888 | 182.82 |
| 0.7020833333333334 | 182.82 |
| 0.7027777777777778 | 187.378 |
| 0.7034722222222222 | 187.378 |
| 0.7041666666666666 | 191.937 |
| 0.7048611111111112 | 187.378 |
| 0.7055555555555556 | 182.82 |
| 0.7062499999999999 | 182.82 |
| 0.7069444444444444 | 178.264 |
| 0.7076388888888889 | 155.509 |
| 0.7083333333333334 | 173.709 |
| 0.7090277777777777 | 173.709 |
| 0.7097222222222223 | 173.709 |
| 0.7104166666666667 | 173.709 |
| 0.7111111111111111 | 178.264 |
| 0.7118055555555555 | 182.82 |
| 0.7125 | 187.378 |
| 0.7131944444444445 | 187.378 |
| 0.7138888888888889 | 191.937 |
| 0.7145833333333332 | 191.937 |
| 0.7152777777777778 | 191.937 |
| 0.7159722222222222 | 187.378 |
| 0.7166666666666667 | 182.82 |
| 0.717361111111111 | 178.264 |
| 0.7180555555555556 | 178.264 |
| 0.71875 | 173.709 |
| 0.7194444444444444 | 169.156 |
| 0.720138888888889 | 164.605 |
| 0.7208333333333333 | 160.056 |
| 0.7215277777777778 | 155.509 |
| 0.7222222222222222 | 155.509 |
| 0.7229166666666668 | 155.509 |
| 0.7236111111111111 | 155.509 |
| 0.7243055555555555 | 155.509 |
| 0.725 | 150.964 |
| 0.7256944444444445 | 150.964 |
| 0.7263888888888889 | 150.964 |
| 0.7270833333333333 | 150.964 |
| 0.7277777777777777 | 150.964 |
| 0.7284722222222223 | 155.509 |
| 0.7291666666666666 | 155.509 |
| 0.7298611111111111 | 155.509 |
| 0.7305555555555556 | 155.509 |
| 0.7312500000000001 | 155.509 |
| 0.7319444444444444 | 160.056 |
| 0.7326388888888888 | 160.056 |
| 0.7333333333333334 | 164.605 |
| 0.7340277777777778 | 160.056 |
| 0.7347222222222222 | 160.056 |
| 0.7354166666666666 | 160.056 |
| 0.7361111111111112 | 155.509 |
| 0.7368055555555556 | 155.509 |
| 0.7374999999999999 | 155.509 |
| 0.7381944444444444 | 155.509 |
| 0.7388888888888889 | 150.964 |
| 0.7395833333333334 | 150.964 |
| 0.7402777777777777 | 150.964 |
| 0.7409722222222223 | 146.423 |
| 0.7416666666666667 | 150.964 |
| 0.7423611111111111 | 155.509 |
| 0.7430555555555555 | 155.509 |
| 0.74375 | 155.509 |
| 0.7444444444444445 | 150.964 |
| 0.7451388888888889 | 150.964 |
| 0.7458333333333332 | 150.964 |
| 0.7465277777777778 | 146.423 |
| 0.7472222222222222 | 141.884 |
| 0.7479166666666667 | 141.884 |
| 0.748611111111111 | 137.347 |
| 0.7493055555555556 | 137.347 |
| 0.75 | 137.347 |
| 0.7506944444444444 | 132.814 |
| 0.751388888888889 | 132.814 |
| 0.7520833333333333 | 128.284 |
| 0.7527777777777778 | 128.284 |
| 0.7534722222222222 | 128.284 |
| 0.7541666666666668 | 128.284 |
| 0.7548611111111111 | 123.758 |
| 0.7555555555555555 | 119.235 |
| 0.75625 | 119.235 |
| 0.7569444444444445 | 119.235 |
| 0.7576388888888889 | 119.235 |
| 0.7583333333333333 | 110.201 |
| 0.7590277777777777 | 114.716 |
| 0.7597222222222223 | 114.716 |
| 0.7604166666666666 | 105.69 |
| 0.7611111111111111 | 101.184 |
| 0.7618055555555556 | 101.184 |
| 0.7625000000000001 | 101.184 |
| 0.7631944444444444 | 96.682 |
| 0.7638888888888888 | 96.682 |
| 0.7645833333333334 | 92.184 |
| 0.7652777777777778 | 92.184 |
| 0.7659722222222222 | 87.692 |
| 0.7666666666666666 | 83.205 |
| 0.7673611111111112 | 83.205 |
| 0.7680555555555556 | 83.205 |
| 0.7687499999999999 | 83.205 |
| 0.7694444444444444 | 83.205 |
| 0.7701388888888889 | 83.205 |
| 0.7708333333333334 | 83.205 |
| 0.7715277777777777 | 78.722 |
| 0.7722222222222223 | 83.205 |
| 0.7729166666666667 | 83.205 |
| 0.7736111111111111 | 83.205 |
| 0.7743055555555555 | 83.205 |
| 0.775 | 83.205 |
| 0.7756944444444445 | 83.205 |
| 0.7763888888888889 | 83.205 |
| 0.7770833333333332 | 78.722 |
| 0.7777777777777778 | 78.722 |
| 0.7784722222222222 | 78.722 |
| 0.7791666666666667 | 74.246 |
| 0.779861111111111 | 74.246 |
| 0.7805555555555556 | 74.246 |
| 0.78125 | 74.246 |
| 0.7819444444444444 | 74.246 |
| 0.782638888888889 | 74.246 |
| 0.7833333333333333 | 69.775 |
| 0.7840277777777778 | 69.775 |
| 0.7847222222222222 | 69.775 |
| 0.7854166666666668 | 69.775 |
| 0.7861111111111111 | 69.775 |
| 0.7868055555555555 | 69.775 |
| 0.7875 | 65.31 |
| 0.7881944444444445 | 65.31 |
| 0.7888888888888889 | 60.85 |
| 0.7895833333333333 | 60.85 |
| 0.7902777777777777 | 60.85 |
| 0.7909722222222223 | 56.398 |
| 0.7916666666666666 | 56.398 |
| 0.7923611111111111 | 56.398 |
| 0.7930555555555556 | 56.398 |
| 0.7937500000000001 | 51.951 |
| 0.7944444444444444 | 51.951 |
| 0.7951388888888888 | 51.951 |
| 0.7958333333333334 | 51.951 |
| 0.7965277777777778 | 47.511 |
| 0.7972222222222222 | 47.511 |
| 0.7979166666666666 | 47.511 |
| 0.7986111111111112 | 47.511 |
| 0.7993055555555556 | 47.511 |
| 0.7999999999999999 | 47.511 |
| 0.8006944444444444 | 47.511 |
| 0.8013888888888889 | 47.511 |
| 0.8020833333333334 | 47.511 |
| 0.8027777777777777 | 47.511 |
| 0.8034722222222223 | 47.511 |
| 0.8041666666666667 | 47.511 |
| 0.8048611111111111 | 47.511 |
| 0.8055555555555555 | 47.511 |
| 0.80625 | 47.511 |
| 0.8069444444444445 | 47.511 |
| 0.8076388888888889 | 43.079 |
| 0.8083333333333332 | 43.079 |
| 0.8090277777777778 | 43.079 |
| 0.8097222222222222 | 43.079 |
| 0.8104166666666667 | 43.079 |
| 0.811111111111111 | 43.079 |
| 0.8118055555555556 | 43.079 |
| 0.8125 | 43.079 |
| 0.8131944444444444 | 43.079 |
| 0.813888888888889 | 38.653 |
| 0.8145833333333333 | 43.079 |
| 0.8152777777777778 | 43.079 |
| 0.8159722222222222 | 43.079 |
| 0.8166666666666668 | 47.511 |
| 0.8173611111111111 | 47.511 |
| 0.8180555555555555 | 43.079 |
| 0.81875 | 43.079 |
| 0.8194444444444445 | 43.079 |
| 0.8201388888888889 | 43.079 |
| 0.8208333333333333 | 43.079 |
| 0.8215277777777777 | 43.079 |
| 0.8222222222222223 | 38.653 |
| 0.8229166666666666 | 38.653 |
| 0.8236111111111111 | 38.653 |
| 0.8243055555555556 | 38.653 |
| 0.8250000000000001 | 34.234 |
| 0.8256944444444444 | 34.234 |
| 0.8263888888888888 | 34.234 |
| 0.8270833333333334 | 34.234 |
| 0.8277777777777778 | 34.234 |
| 0.8284722222222222 | 34.234 |
| 0.8291666666666666 | 29.823 |
| 0.8298611111111112 | 29.823 |
| 0.8305555555555556 | 29.823 |
| 0.8312499999999999 | 29.823 |
| 0.8319444444444444 | 25.419 |
| 0.8326388888888889 | 25.419 |
| 0.8333333333333334 | 25.419 |
| 0.8340277777777777 | 25.419 |
| 0.8347222222222223 | 25.419 |
| 0.8354166666666667 | 25.419 |
| 0.8361111111111111 | 25.419 |
| 0.8368055555555555 | 25.419 |
| 0.8375 | 21.024 |
| 0.8381944444444445 | 25.419 |
| 0.8388888888888889 | 21.024 |
| 0.8395833333333332 | 21.024 |
| 0.8402777777777778 | 21.024 |
| 0.8409722222222222 | 21.024 |
| 0.8416666666666667 | 21.024 |
| 0.842361111111111 | 21.024 |
| 0.8430555555555556 | 21.024 |
| 0.84375 | 21.024 |
| 0.8444444444444444 | 21.024 |
| 0.845138888888889 | 16.636 |
| 0.8458333333333333 | 16.636 |
| 0.8465277777777778 | 16.636 |
| 0.8472222222222222 | 16.636 |
| 0.8479166666666668 | 12.257 |
| 0.8486111111111111 | 12.257 |
| 0.8493055555555555 | 12.257 |
| 0.85 | 12.257 |
| 0.8506944444444445 | 12.257 |
| 0.8513888888888889 | 12.257 |
| 0.8520833333333333 | 7.887 |
| 0.8527777777777777 | 7.887 |
| 0.8534722222222223 | 7.887 |
| 0.8541666666666666 | 7.887 |
| 0.8548611111111111 | 3.525 |
| 0.8555555555555556 | 3.525 |
| 0.8562500000000001 | 3.525 |
| 0.8569444444444444 | 3.525 |
| 0.8576388888888888 | 3.525 |
| 0.8583333333333334 | 3.525 |
| 0.8590277777777778 | 3.525 |
| 0.8597222222222222 | 3.525 |
| 0.8604166666666666 | 0 |
| 0.8611111111111112 | 0 |
| 0.8618055555555556 | 0 |
| 0.8624999999999999 | 0 |
| 0.8631944444444444 | 0 |
| 0.8638888888888889 | 0 |
| 0.8645833333333334 | 0 |
| 0.8652777777777777 | 0 |
| 0.8659722222222223 | 0 |
| 0.8666666666666667 | 0 |
| 0.8673611111111111 | 0 |
| 0.8680555555555555 | 0 |
| 0.86875 | 0 |
| 0.8694444444444445 | 0 |
| 0.8701388888888889 | 0 |
| 0.8708333333333332 | 0 |
| 0.8715277777777778 | 0 |
| 0.8722222222222222 | 0 |
| 0.8729166666666667 | 0 |
| 0.873611111111111 | 0 |
| 0.8743055555555556 | 0 |
| 0.875 | 0 |
| 0.8756944444444444 | 0 |
| 0.876388888888889 | 0 |
| 0.8770833333333333 | 0 |
| 0.8777777777777778 | 0 |
| 0.8784722222222222 | 0 |
| 0.8791666666666668 | 0 |
| 0.8798611111111111 | 0 |
| 0.8805555555555555 | 0 |
| 0.88125 | 0 |
| 0.8819444444444445 | 0 |
| 0.8826388888888889 | 0 |
| 0.8833333333333333 | 0 |
| 0.8840277777777777 | 0 |
| 0.8847222222222223 | 0 |
| 0.8854166666666666 | 0 |
| 0.8861111111111111 | 0 |
| 0.8868055555555556 | 0 |
| 0.8875000000000001 | 0 |
| 0.8881944444444444 | 0 |
| 0.8888888888888888 | 0 |
| 0.8895833333333334 | 0 |
| 0.8902777777777778 | 0 |
| 0.8909722222222222 | 0 |
| 0.8916666666666666 | 0 |
| 0.8923611111111112 | 0 |
| 0.8930555555555556 | 0 |
| 0.8937499999999999 | 0 |
| 0.8944444444444444 | 0 |
| 0.8951388888888889 | 0 |
| 0.8958333333333334 | 0 |
| 0.8965277777777777 | 0 |
| 0.8972222222222223 | 0 |
| 0.8979166666666667 | 0 |
| 0.8986111111111111 | 0 |
| 0.8993055555555555 | 0 |
| 0.9 | 0 |
| 0.9006944444444445 | 0 |
| 0.9013888888888889 | 0 |
| 0.9020833333333332 | 0 |
| 0.9027777777777778 | 0 |
| 0.9034722222222222 | 0 |
| 0.9041666666666667 | 0 |
| 0.904861111111111 | 0 |
| 0.9055555555555556 | 0 |
| 0.90625 | 0 |
| 0.9069444444444444 | 0 |
| 0.907638888888889 | 0 |
| 0.9083333333333333 | 0 |
| 0.9090277777777778 | 0 |
| 0.9097222222222222 | 0 |
| 0.9104166666666668 | 0 |
| 0.9111111111111111 | 0 |
| 0.9118055555555555 | 0 |
| 0.9125 | 0 |
| 0.9131944444444445 | 0 |
| 0.9138888888888889 | 0 |
| 0.9145833333333333 | 0 |
| 0.9152777777777777 | 0 |
| 0.9159722222222223 | 0 |
| 0.9166666666666666 | 0 |
| 0.9173611111111111 | 0 |
| 0.9180555555555556 | 0 |
| 0.9187500000000001 | 0 |
| 0.9194444444444444 | 0 |
| 0.9201388888888888 | 0 |
| 0.9208333333333334 | 0 |
| 0.9215277777777778 | 0 |
| 0.9222222222222222 | 0 |
| 0.9229166666666666 | 0 |
| 0.9236111111111112 | 0 |
| 0.9243055555555556 | 0 |
| 0.9249999999999999 | 0 |
| 0.9256944444444444 | 0 |
| 0.9263888888888889 | 0 |
| 0.9270833333333334 | 0 |
| 0.9277777777777777 | 0 |
| 0.9284722222222223 | 0 |
| 0.9291666666666667 | 0 |
| 0.9298611111111111 | 0 |
| 0.9305555555555555 | 0 |
| 0.93125 | 0 |
| 0.9319444444444445 | 0 |
| 0.9326388888888889 | 0 |
| 0.9333333333333332 | 0 |
| 0.9340277777777778 | 0 |
| 0.9347222222222222 | 0 |
| 0.9354166666666667 | 0 |
| 0.936111111111111 | 0 |
| 0.9368055555555556 | 0 |
| 0.9375 | 0 |
| 0.9381944444444444 | 0 |
| 0.938888888888889 | 0 |
| 0.9395833333333333 | 0 |
| 0.9402777777777778 | 0 |
| 0.9409722222222222 | 0 |
| 0.9416666666666668 | 0 |
| 0.9423611111111111 | 0 |
| 0.9430555555555555 | 0 |
| 0.94375 | 0 |
| 0.9444444444444445 | 0 |
| 0.9451388888888889 | 0 |
| 0.9458333333333333 | 0 |
| 0.9465277777777777 | 0 |
| 0.9472222222222223 | 0 |
| 0.9479166666666666 | 0 |
| 0.9486111111111111 | 0 |
| 0.9493055555555556 | 0 |
| 0.9500000000000001 | 0 |
| 0.9506944444444444 | 0 |
| 0.9513888888888888 | 0 |
| 0.9520833333333334 | 0 |
| 0.9527777777777778 | 0 |
| 0.9534722222222222 | 0 |
| 0.9541666666666666 | 0 |
| 0.9548611111111112 | 0 |
| 0.9555555555555556 | 0 |
| 0.9562499999999999 | 0 |
| 0.9569444444444444 | 0 |
| 0.9576388888888889 | 0 |
| 0.9583333333333334 | 0 |
| 0.9590277777777777 | 0 |
| 0.9597222222222223 | 0 |
| 0.9604166666666667 | 0 |
| 0.9611111111111111 | 0 |
| 0.9618055555555555 | 0 |
| 0.9625 | 0 |
| 0.9631944444444445 | 0 |
| 0.9638888888888889 | 0 |
| 0.9645833333333332 | 0 |
| 0.9652777777777778 | 0 |
| 0.9659722222222222 | 0 |
| 0.9666666666666667 | 0 |
| 0.967361111111111 | 0 |
| 0.9680555555555556 | 0 |
| 0.96875 | 0 |
| 0.9694444444444444 | 0 |
| 0.970138888888889 | 0 |
| 0.9708333333333333 | 0 |
| 0.9715277777777778 | 0 |
| 0.9722222222222222 | 0 |
| 0.9729166666666668 | 0 |
| 0.9736111111111111 | 0 |
| 0.9743055555555555 | 0 |
| 0.975 | 0 |
| 0.9756944444444445 | 0 |
| 0.9763888888888889 | 0 |
| 0.9770833333333333 | 0 |
| 0.9777777777777777 | 0 |
| 0.9784722222222223 | 0 |
| 0.9791666666666666 | 0 |
| 0.9798611111111111 | 0 |
| 0.9805555555555556 | 0 |
| 0.9812500000000001 | 0 |
| 0.9819444444444444 | 0 |
| 0.9826388888888888 | 0 |
| 0.9833333333333334 | 0 |
| 0.9840277777777778 | 0 |
| 0.9847222222222222 | 0 |
| 0.9854166666666666 | 0 |
| 0.9861111111111112 | 0 |
| 0.9868055555555556 | 0 |
| 0.9874999999999999 | 0 |
| 0.9881944444444444 | 0 |
| 0.9888888888888889 | 0 |
| 0.9895833333333334 | 0 |
| 0.9902777777777777 | 0 |
| 0.9909722222222223 | 0 |
| 0.9916666666666667 | 0 |
| 0.9923611111111111 | 0 |
| 0.9930555555555555 | 0 |
| 0.99375 | 0 |
| 0.9944444444444445 | 0 |
| 0.9951388888888889 | 0 |
| 0.9958333333333332 | 0 |
| 0.9965277777777778 | 0 |
| 0.9972222222222222 | 0 |
| 0.9979166666666667 | 0 |
| 0.998611111111111 | 0 |
| 0.9993055555555556 | 0 |